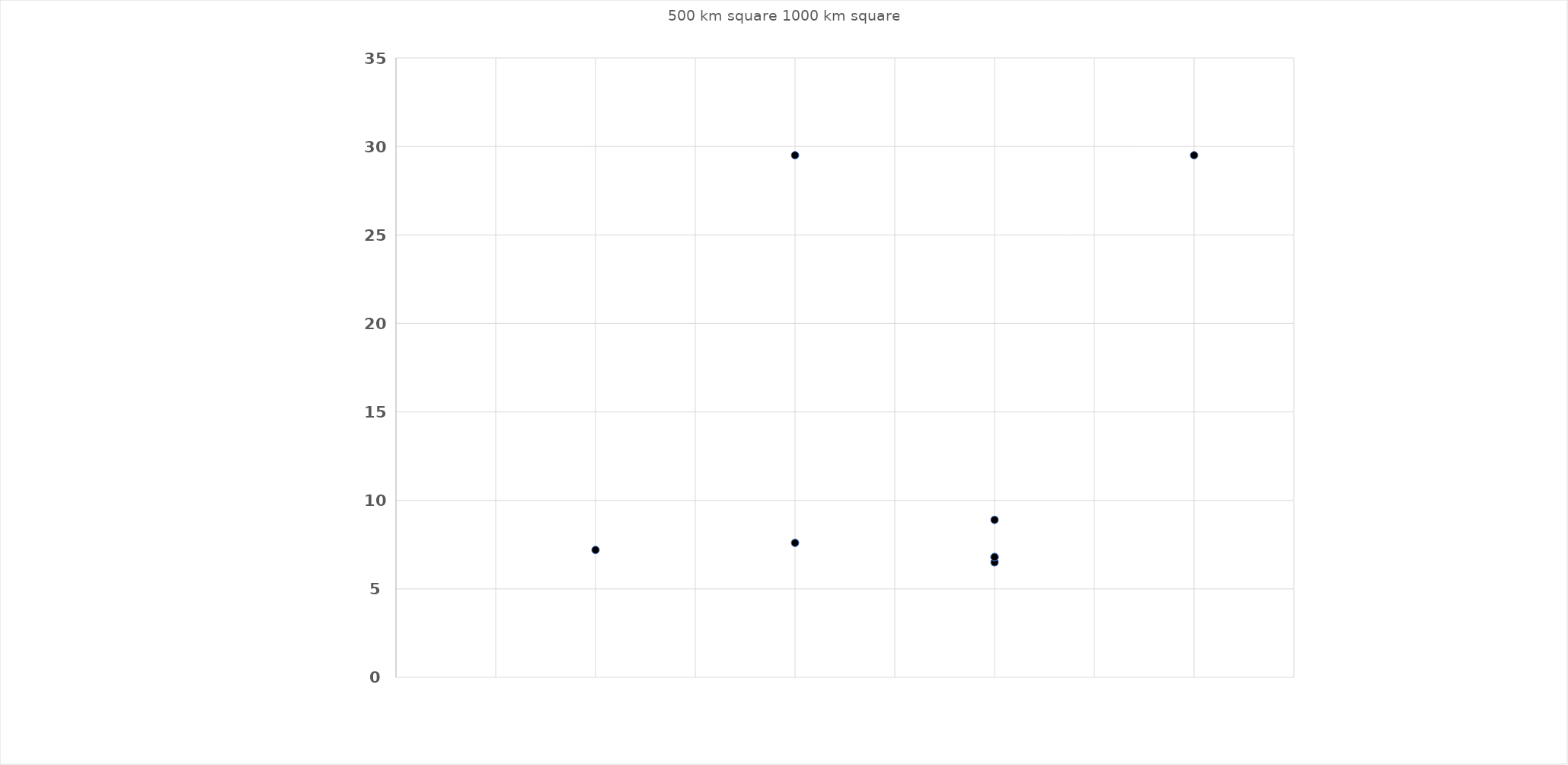
| Category | Series 0 |
|---|---|
| 1.0 | 7.2 |
| 2.0 | 7.6 |
| 3.0 | 6.8 |
| 3.0 | 6.5 |
| 3.0 | 8.9 |
| 3.0 | 6.8 |
| 2.0 | 29.5 |
| 4.0 | 29.5 |